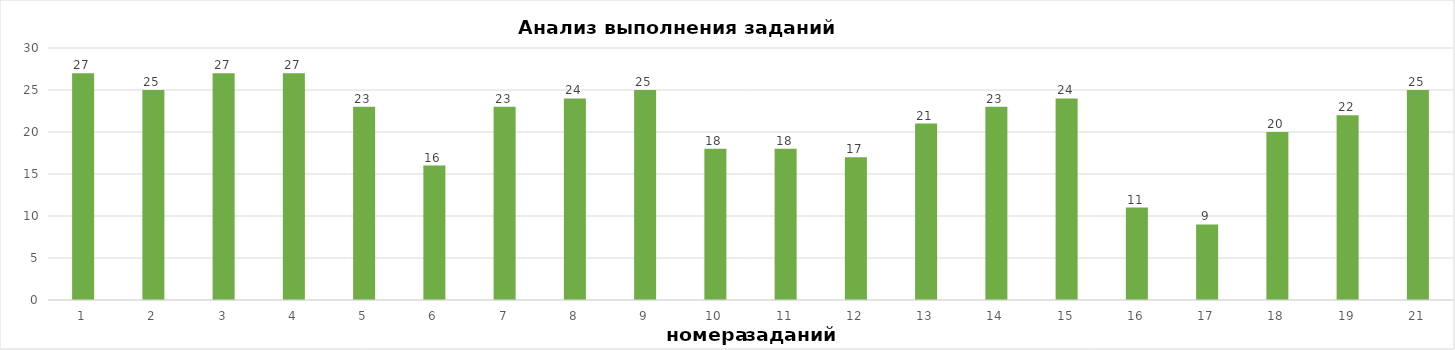
| Category | задания |
|---|---|
| 1.0 | 27 |
| 2.0 | 25 |
| 3.0 | 27 |
| 4.0 | 27 |
| 5.0 | 23 |
| 6.0 | 16 |
| 7.0 | 23 |
| 8.0 | 24 |
| 9.0 | 25 |
| 10.0 | 18 |
| 11.0 | 18 |
| 12.0 | 17 |
| 13.0 | 21 |
| 14.0 | 23 |
| 15.0 | 24 |
| 16.0 | 11 |
| 17.0 | 9 |
| 18.0 | 20 |
| 19.0 | 22 |
| 21.0 | 25 |